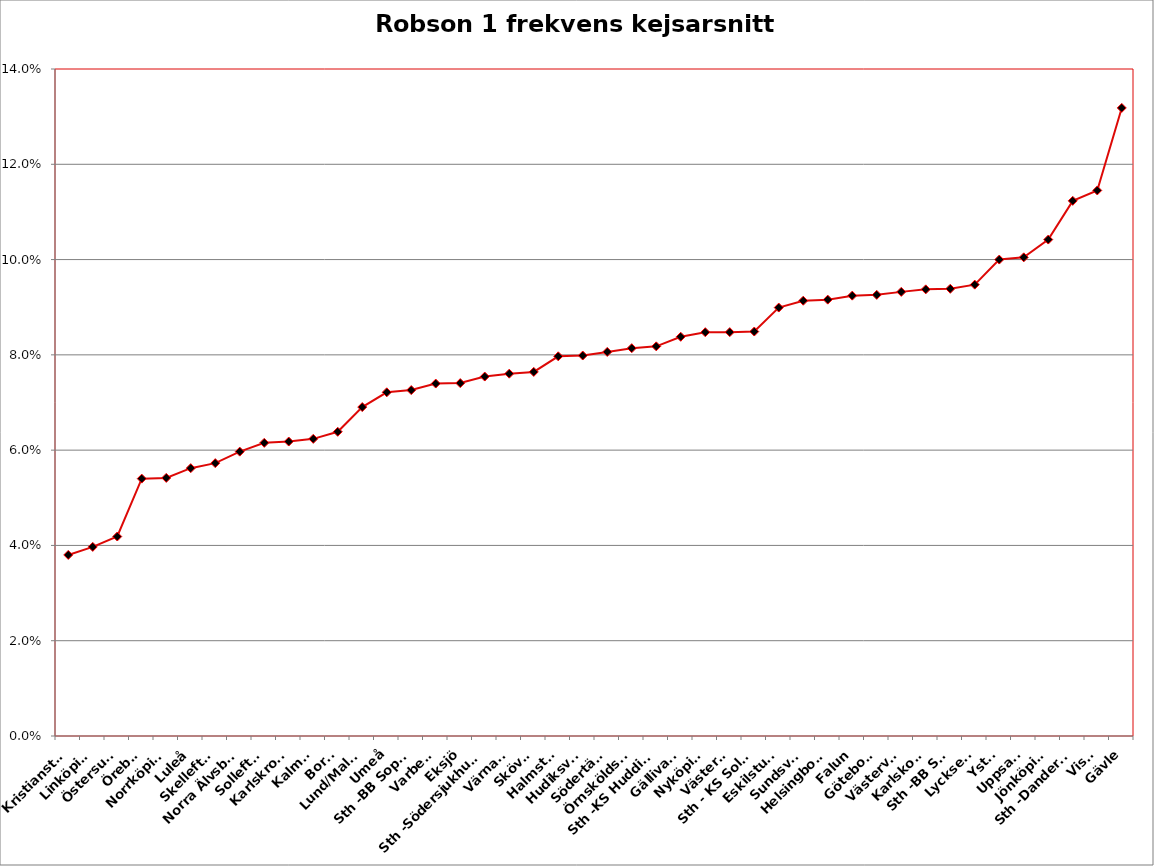
| Category | Robson 1 frekvens kejsarsnitt 2014 |
|---|---|
| Kristianstad | 0.038 |
| Linköping | 0.04 |
| Östersund | 0.042 |
| Örebro | 0.054 |
| Norrköping | 0.054 |
| Luleå | 0.056 |
| Skellefteå | 0.057 |
| Norra Älvsborg | 0.06 |
| Sollefteå | 0.062 |
| Karlskrona | 0.062 |
| Kalmar | 0.062 |
| Borås | 0.064 |
| Lund/Malmö | 0.069 |
| Umeå | 0.072 |
| Sth -BB Sophia | 0.073 |
| Varberg | 0.074 |
| Eksjö | 0.074 |
| Sth -Södersjukhuset | 0.075 |
| Värnamo | 0.076 |
| Skövde | 0.076 |
| Halmstad | 0.08 |
| Hudiksvall | 0.08 |
| Södertälje | 0.081 |
| Örnsköldsvik | 0.081 |
| Sth -KS Huddinge | 0.082 |
| Gällivare | 0.084 |
| Nyköping | 0.085 |
| Västerås | 0.085 |
| Sth - KS Solna | 0.085 |
| Eskilstuna | 0.09 |
| Sundsvall | 0.091 |
| Helsingborg | 0.092 |
| Falun | 0.092 |
| Göteborg | 0.093 |
| Västervik | 0.093 |
| Karlskoga | 0.094 |
| Sth -BB Sth | 0.094 |
| Lycksele | 0.095 |
| Ystad | 0.1 |
| Uppsala | 0.1 |
| Jönköping | 0.104 |
| Sth -Danderyd | 0.112 |
| Visby | 0.115 |
| Gävle | 0.132 |